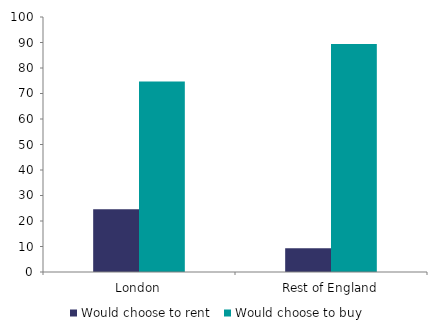
| Category | Would choose to rent  | Series 1 | Would choose to buy |
|---|---|---|---|
| London | 24.644 |  | 74.683 |
| Rest of England | 9.303 |  | 89.433 |